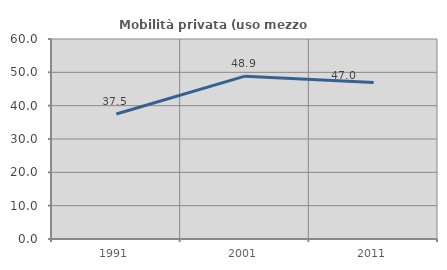
| Category | Mobilità privata (uso mezzo privato) |
|---|---|
| 1991.0 | 37.5 |
| 2001.0 | 48.855 |
| 2011.0 | 46.98 |